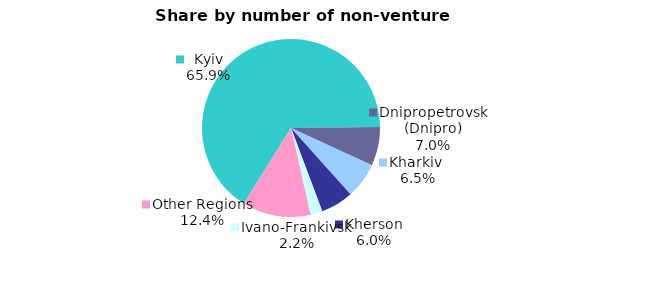
| Category | Series 0 |
|---|---|
| Kyiv | 0.718 |
| Dnipropetrovsk (Dnipro) | 0.076 |
| Kharkiv  | 0.071 |
| Kherson | 0.065 |
| Ivano-Frankivsk | 0.024 |
| Other Regions | 0.135 |